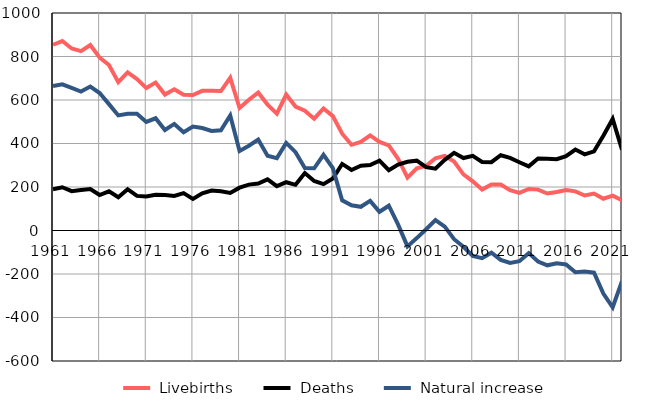
| Category |  Livebirths |  Deaths |  Natural increase |
|---|---|---|---|
| 1961.0 | 854 | 190 | 664 |
| 1962.0 | 871 | 199 | 672 |
| 1963.0 | 837 | 181 | 656 |
| 1964.0 | 825 | 186 | 639 |
| 1965.0 | 853 | 191 | 662 |
| 1966.0 | 795 | 163 | 632 |
| 1967.0 | 761 | 180 | 581 |
| 1968.0 | 682 | 153 | 529 |
| 1969.0 | 727 | 190 | 537 |
| 1970.0 | 696 | 159 | 537 |
| 1971.0 | 655 | 156 | 499 |
| 1972.0 | 680 | 164 | 516 |
| 1973.0 | 625 | 163 | 462 |
| 1974.0 | 649 | 159 | 490 |
| 1975.0 | 624 | 172 | 452 |
| 1976.0 | 623 | 145 | 478 |
| 1977.0 | 642 | 171 | 471 |
| 1978.0 | 642 | 184 | 458 |
| 1979.0 | 641 | 180 | 461 |
| 1980.0 | 702 | 173 | 529 |
| 1981.0 | 563 | 197 | 366 |
| 1982.0 | 601 | 211 | 390 |
| 1983.0 | 634 | 216 | 418 |
| 1984.0 | 579 | 235 | 344 |
| 1985.0 | 537 | 204 | 333 |
| 1986.0 | 625 | 222 | 403 |
| 1987.0 | 570 | 210 | 360 |
| 1988.0 | 551 | 264 | 287 |
| 1989.0 | 514 | 228 | 286 |
| 1990.0 | 561 | 213 | 348 |
| 1991.0 | 526 | 239 | 287 |
| 1992.0 | 445 | 306 | 139 |
| 1993.0 | 394 | 278 | 116 |
| 1994.0 | 407 | 298 | 109 |
| 1995.0 | 437 | 301 | 136 |
| 1996.0 | 407 | 321 | 86 |
| 1997.0 | 391 | 277 | 114 |
| 1998.0 | 330 | 303 | 27 |
| 1999.0 | 243 | 316 | -73 |
| 2000.0 | 286 | 321 | -35 |
| 2001.0 | 297 | 291 | 6 |
| 2002.0 | 332 | 284 | 48 |
| 2003.0 | 343 | 325 | 18 |
| 2004.0 | 317 | 357 | -40 |
| 2005.0 | 258 | 333 | -75 |
| 2006.0 | 226 | 343 | -117 |
| 2007.0 | 188 | 315 | -127 |
| 2008.0 | 212 | 314 | -102 |
| 2009.0 | 211 | 346 | -135 |
| 2010.0 | 185 | 334 | -149 |
| 2011.0 | 173 | 314 | -141 |
| 2012.0 | 191 | 295 | -104 |
| 2013.0 | 188 | 331 | -143 |
| 2014.0 | 170 | 330 | -160 |
| 2015.0 | 177 | 328 | -151 |
| 2016.0 | 186 | 342 | -156 |
| 2017.0 | 180 | 372 | -192 |
| 2018.0 | 161 | 350 | -189 |
| 2019.0 | 170 | 364 | -194 |
| 2020.0 | 146 | 436 | -290 |
| 2021.0 | 160 | 513 | -353 |
| 2022.0 | 139 | 372 | -233 |